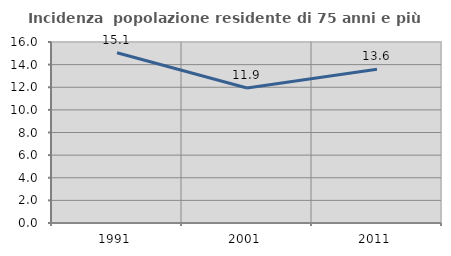
| Category | Incidenza  popolazione residente di 75 anni e più |
|---|---|
| 1991.0 | 15.054 |
| 2001.0 | 11.938 |
| 2011.0 | 13.6 |